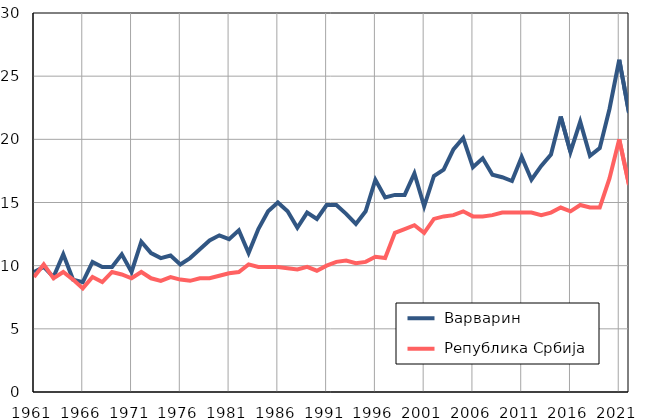
| Category |  Варварин |  Република Србија |
|---|---|---|
| 1961.0 | 9.5 | 9.1 |
| 1962.0 | 9.9 | 10.1 |
| 1963.0 | 9.1 | 9 |
| 1964.0 | 10.9 | 9.5 |
| 1965.0 | 8.9 | 8.9 |
| 1966.0 | 8.7 | 8.2 |
| 1967.0 | 10.3 | 9.1 |
| 1968.0 | 9.9 | 8.7 |
| 1969.0 | 9.9 | 9.5 |
| 1970.0 | 10.9 | 9.3 |
| 1971.0 | 9.5 | 9 |
| 1972.0 | 11.9 | 9.5 |
| 1973.0 | 11 | 9 |
| 1974.0 | 10.6 | 8.8 |
| 1975.0 | 10.8 | 9.1 |
| 1976.0 | 10.1 | 8.9 |
| 1977.0 | 10.6 | 8.8 |
| 1978.0 | 11.3 | 9 |
| 1979.0 | 12 | 9 |
| 1980.0 | 12.4 | 9.2 |
| 1981.0 | 12.1 | 9.4 |
| 1982.0 | 12.8 | 9.5 |
| 1983.0 | 11 | 10.1 |
| 1984.0 | 12.9 | 9.9 |
| 1985.0 | 14.3 | 9.9 |
| 1986.0 | 15 | 9.9 |
| 1987.0 | 14.3 | 9.8 |
| 1988.0 | 13 | 9.7 |
| 1989.0 | 14.2 | 9.9 |
| 1990.0 | 13.7 | 9.6 |
| 1991.0 | 14.8 | 10 |
| 1992.0 | 14.8 | 10.3 |
| 1993.0 | 14.1 | 10.4 |
| 1994.0 | 13.3 | 10.2 |
| 1995.0 | 14.3 | 10.3 |
| 1996.0 | 16.8 | 10.7 |
| 1997.0 | 15.4 | 10.6 |
| 1998.0 | 15.6 | 12.6 |
| 1999.0 | 15.6 | 12.9 |
| 2000.0 | 17.3 | 13.2 |
| 2001.0 | 14.7 | 12.6 |
| 2002.0 | 17.1 | 13.7 |
| 2003.0 | 17.6 | 13.9 |
| 2004.0 | 19.2 | 14 |
| 2005.0 | 20.1 | 14.3 |
| 2006.0 | 17.8 | 13.9 |
| 2007.0 | 18.5 | 13.9 |
| 2008.0 | 17.2 | 14 |
| 2009.0 | 17 | 14.2 |
| 2010.0 | 16.7 | 14.2 |
| 2011.0 | 18.6 | 14.2 |
| 2012.0 | 16.8 | 14.2 |
| 2013.0 | 17.9 | 14 |
| 2014.0 | 18.8 | 14.2 |
| 2015.0 | 21.8 | 14.6 |
| 2016.0 | 19 | 14.3 |
| 2017.0 | 21.4 | 14.8 |
| 2018.0 | 18.7 | 14.6 |
| 2019.0 | 19.3 | 14.6 |
| 2020.0 | 22.4 | 16.9 |
| 2021.0 | 26.3 | 20 |
| 2022.0 | 22.1 | 16.4 |